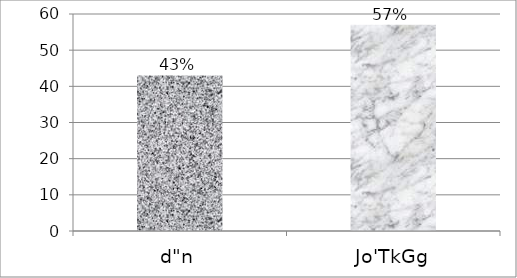
| Category | Series 0 |
|---|---|
| d"n | 43 |
| Jo'TkGg | 57 |